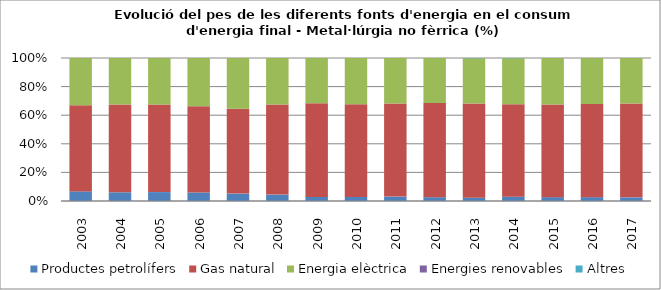
| Category | Productes petrolífers | Gas natural | Energia elèctrica | Energies renovables | Altres |
|---|---|---|---|---|---|
| 2003.0 | 3.7 | 33.1 | 18.2 | 0 | 0 |
| 2004.0 | 3.6 | 36.2 | 19.2 | 0 | 0 |
| 2005.0 | 3.6 | 35.4 | 18.8 | 0 | 0 |
| 2006.0 | 3.5 | 35.3 | 19.8 | 0 | 0 |
| 2007.0 | 3 | 34.4 | 20.5 | 0 | 0 |
| 2008.0 | 2.6 | 36.5 | 18.8 | 0 | 0 |
| 2009.0 | 1.4 | 32.1 | 15.5 | 0 | 0 |
| 2010.0 | 1.5 | 34.6 | 17.2 | 0 | 0 |
| 2011.0 | 1.7 | 35.8 | 17.5 | 0 | 0 |
| 2012.0 | 1.4 | 34.6 | 16.5 | 0 | 0 |
| 2013.0 | 1.2 | 33.8 | 16.2 | 0 | 0.1 |
| 2014.0 | 1.6 | 34.3 | 17.1 | 0 | 0.1 |
| 2015.0 | 1.5 | 36 | 18 | 0 | 0 |
| 2016.0 | 1.6 | 38.8 | 19.2 | 0 | 0 |
| 2017.0 | 1.6 | 41.2 | 19.9 | 0 | 0 |